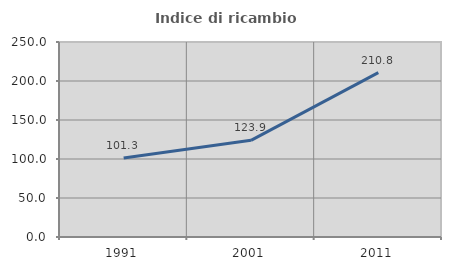
| Category | Indice di ricambio occupazionale  |
|---|---|
| 1991.0 | 101.323 |
| 2001.0 | 123.92 |
| 2011.0 | 210.814 |